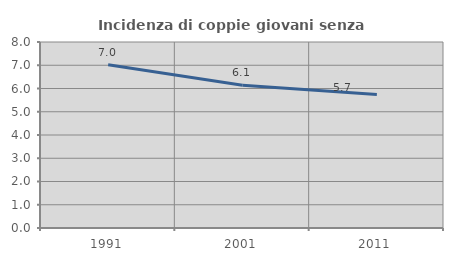
| Category | Incidenza di coppie giovani senza figli |
|---|---|
| 1991.0 | 7.018 |
| 2001.0 | 6.138 |
| 2011.0 | 5.745 |